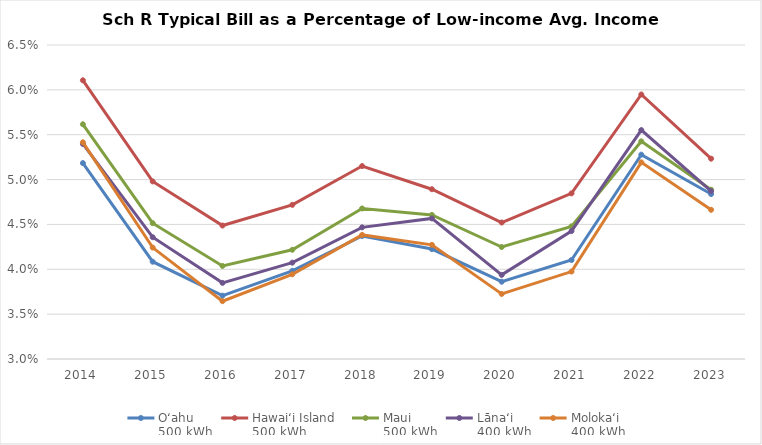
| Category | Oʻahu
500 kWh | Hawaiʻi Island
500 kWh | Maui
500 kWh | Lānaʻi
400 kWh | Molokaʻi
400 kWh |
|---|---|---|---|---|---|
| 2014.0 | 0.052 | 0.061 | 0.056 | 0.054 | 0.054 |
| 2015.0 | 0.041 | 0.05 | 0.045 | 0.044 | 0.042 |
| 2016.0 | 0.037 | 0.045 | 0.04 | 0.038 | 0.036 |
| 2017.0 | 0.04 | 0.047 | 0.042 | 0.041 | 0.039 |
| 2018.0 | 0.044 | 0.052 | 0.047 | 0.045 | 0.044 |
| 2019.0 | 0.042 | 0.049 | 0.046 | 0.046 | 0.043 |
| 2020.0 | 0.039 | 0.045 | 0.042 | 0.039 | 0.037 |
| 2021.0 | 0.041 | 0.048 | 0.045 | 0.044 | 0.04 |
| 2022.0 | 0.053 | 0.059 | 0.054 | 0.056 | 0.052 |
| 2023.0 | 0.048 | 0.052 | 0.049 | 0.049 | 0.047 |